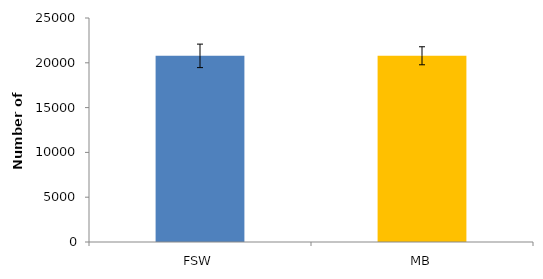
| Category | Series 0 |
|---|---|
| FSW | 20773.634 |
| MB | 20784.544 |